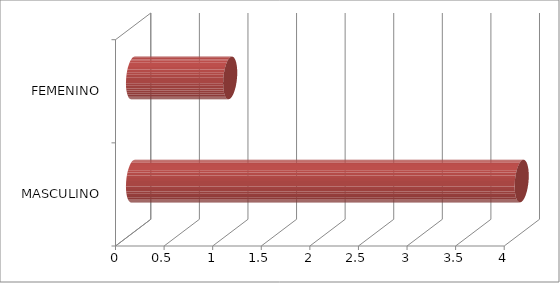
| Category | Series 0 |
|---|---|
| MASCULINO | 4 |
| FEMENINO | 1 |